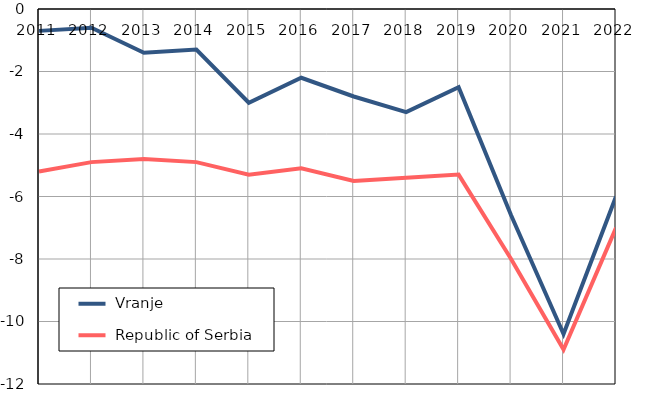
| Category |  Vranje |  Republic of Serbia |
|---|---|---|
| 2011.0 | -0.7 | -5.2 |
| 2012.0 | -0.6 | -4.9 |
| 2013.0 | -1.4 | -4.8 |
| 2014.0 | -1.3 | -4.9 |
| 2015.0 | -3 | -5.3 |
| 2016.0 | -2.2 | -5.1 |
| 2017.0 | -2.8 | -5.5 |
| 2018.0 | -3.3 | -5.4 |
| 2019.0 | -2.5 | -5.3 |
| 2020.0 | -6.6 | -8 |
| 2021.0 | -10.4 | -10.9 |
| 2022.0 | -6 | -7 |